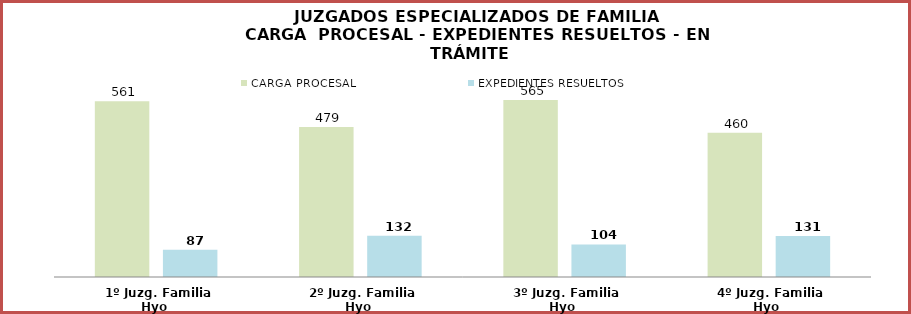
| Category | CARGA PROCESAL | EXPEDIENTES RESUELTOS |
|---|---|---|
| 1º Juzg. Familia Hyo | 561 | 87 |
| 2º Juzg. Familia Hyo | 479 | 132 |
| 3º Juzg. Familia Hyo | 565 | 104 |
| 4º Juzg. Familia Hyo | 460 | 131 |